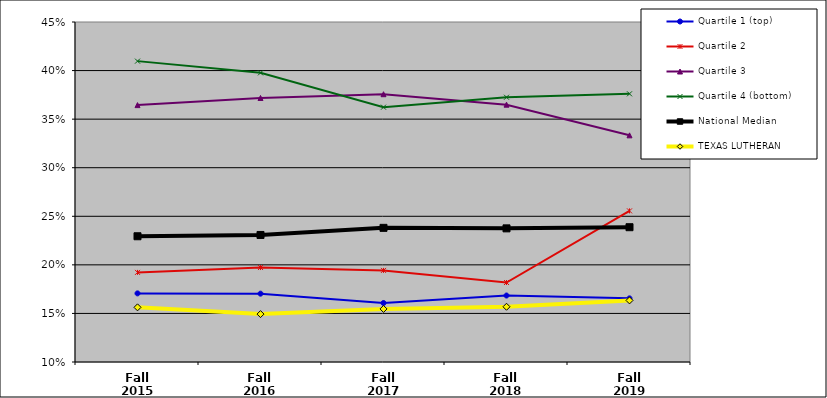
| Category | Quartile 1 (top) | Quartile 2 | Quartile 3 | Quartile 4 (bottom) | National Median | TEXAS LUTHERAN |
|---|---|---|---|---|---|---|
| Fall 2015 | 0.171 | 0.192 | 0.364 | 0.41 | 0.229 | 0.156 |
| Fall 2016 | 0.17 | 0.197 | 0.372 | 0.398 | 0.231 | 0.149 |
| Fall 2017 | 0.161 | 0.194 | 0.376 | 0.362 | 0.238 | 0.155 |
| Fall 2018 | 0.168 | 0.182 | 0.365 | 0.373 | 0.238 | 0.157 |
| Fall 2019 | 0.166 | 0.256 | 0.333 | 0.376 | 0.239 | 0.163 |